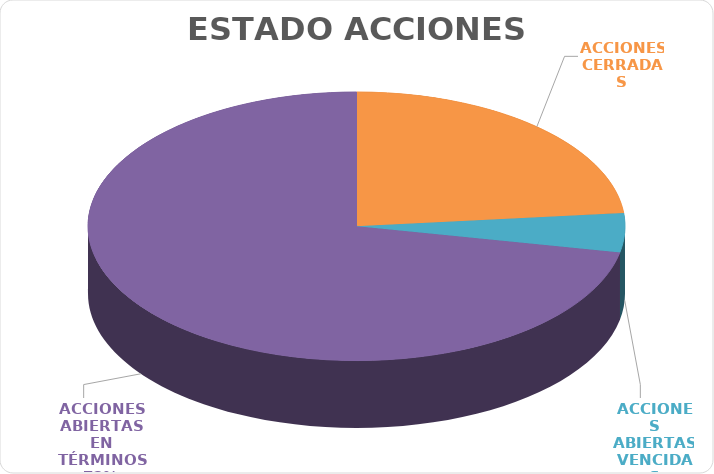
| Category | Series 0 |
|---|---|
| ACCIONES CERRADAS | 30 |
| ACCIONES ABIERTAS VENCIDAS | 6 |
| ACCIONES ABIERTAS EN TÉRMINOS | 92 |